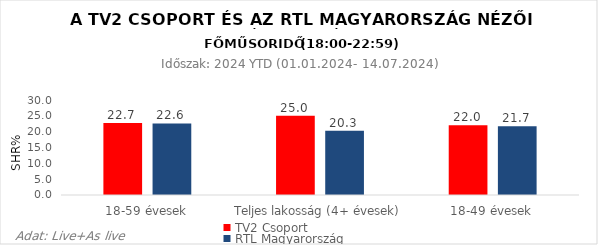
| Category | TV2 Csoport | RTL Magyarország |
|---|---|---|
| 18-59 évesek | 22.7 | 22.6 |
| Teljes lakosság (4+ évesek) | 25 | 20.3 |
| 18-49 évesek | 22 | 21.7 |